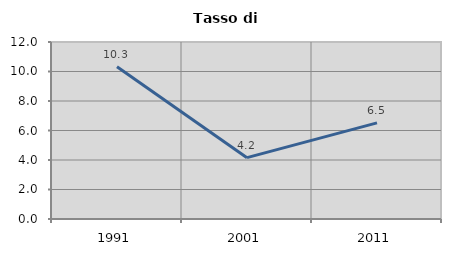
| Category | Tasso di disoccupazione   |
|---|---|
| 1991.0 | 10.327 |
| 2001.0 | 4.158 |
| 2011.0 | 6.516 |